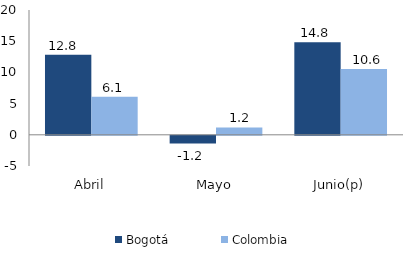
| Category | Bogotá | Colombia |
|---|---|---|
| Abril | 12.818 | 6.106 |
| Mayo | -1.224 | 1.183 |
| Junio(p) | 14.849 | 10.561 |